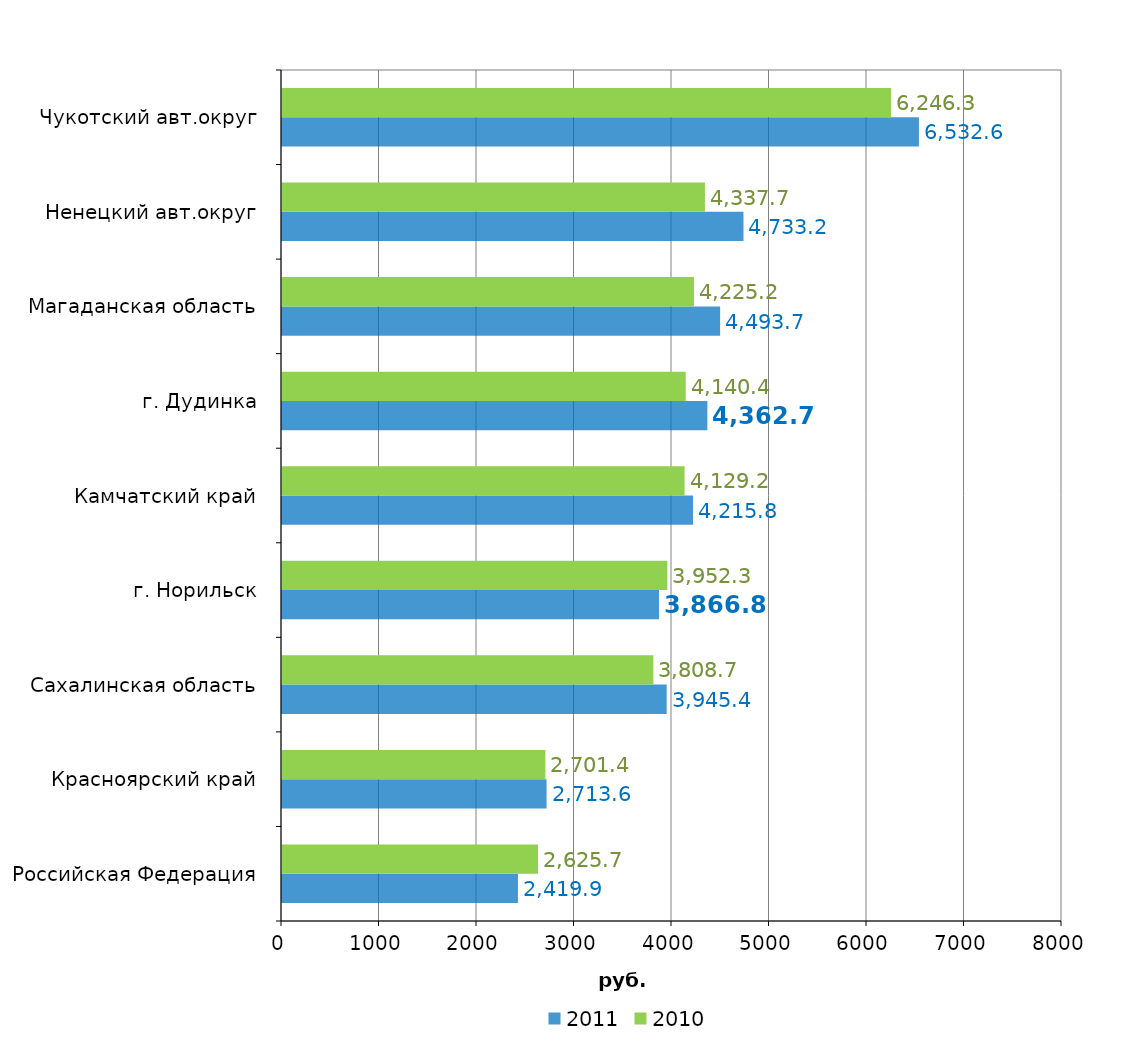
| Category | 2011 | 2010 |
|---|---|---|
| Российская Федеpация | 2419.93 | 2625.65 |
| Красноярский край | 2713.61 | 2701.4 |
| Сахалинская область | 3945.4 | 3808.74 |
| г. Норильск | 3866.83 | 3952.34 |
| Камчатский край | 4215.83 | 4129.16 |
| г. Дудинка | 4362.73 | 4140.36 |
| Магаданская область | 4493.69 | 4225.17 |
| Ненецкий авт.округ | 4733.17 | 4337.71 |
| Чукотский авт.округ | 6532.63 | 6246.31 |